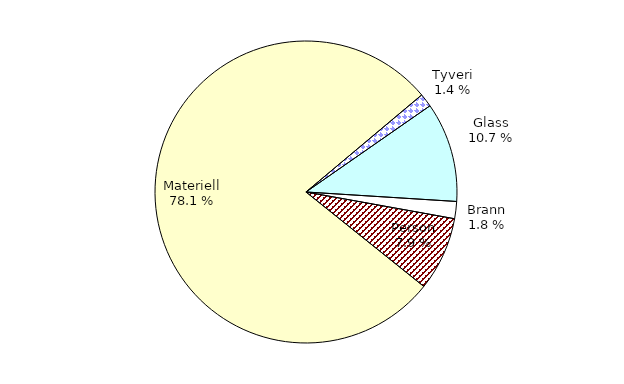
| Category | Series 0 |
|---|---|
| Tyveri | 218.239 |
| Glass | 1617.843 |
| Brann | 278.091 |
| Person | 1200.328 |
| Materiell | 11845.072 |